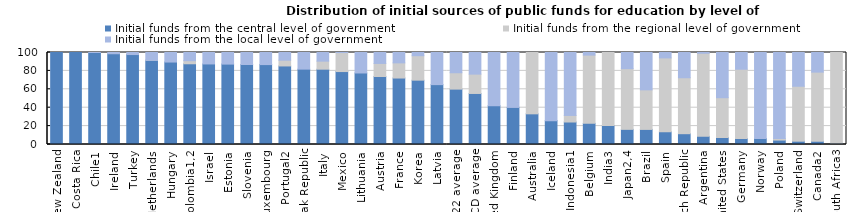
| Category | Initial funds from the central level of government | Initial funds from the regional level of government | Initial funds from the local level of government |
|---|---|---|---|
| New Zealand | 100 | 0 | 0 |
| Costa Rica | 100 | 0 | 0 |
| Chile1 | 99.996 | 0 | 0.004 |
| Ireland | 98.648 | 0 | 1.352 |
| Turkey | 97.771 | 0 | 2.229 |
| Netherlands | 91.533 | 0.035 | 8.432 |
| Hungary | 89.626 | 0 | 10.374 |
| Colombia1,2 | 87.755 | 3.337 | 8.908 |
| Israel | 87.56 | 0 | 12.44 |
| Estonia | 87.383 | 0 | 12.617 |
| Slovenia | 86.948 | 0 | 13.052 |
| Luxembourg | 86.861 | 0 | 13.139 |
| Portugal2 | 85.382 | 6.229 | 8.389 |
| Slovak Republic | 81.916 | 0 | 18.084 |
| Italy | 81.868 | 8.732 | 9.4 |
| Mexico | 79.285 | 20.652 | 0.062 |
| Lithuania | 77.739 | 0 | 22.261 |
| Austria | 73.897 | 14.213 | 11.89 |
| France | 72.253 | 16.474 | 11.274 |
| Korea | 69.94 | 26.56 | 3.5 |
| Latvia | 65.081 | 0 | 34.919 |
| EU22 average | 60.193 | 17.792 | 22.015 |
| OECD average | 55.475 | 21.018 | 23.508 |
| United Kingdom | 42.13 | 0 | 57.87 |
| Finland | 40.304 | 0 | 59.696 |
| Australia | 33.337 | 66.663 | 0 |
| Iceland | 25.945 | 0 | 74.055 |
| Indonesia1 | 24.448 | 7.129 | 68.424 |
| Belgium | 22.999 | 74.182 | 2.819 |
| India3 | 20.553 | 79.447 | 0 |
| Japan2,4 | 16.466 | 65.985 | 17.549 |
| Brazil | 16.405 | 43.002 | 40.593 |
| Spain | 13.747 | 80.38 | 5.874 |
| Czech Republic | 11.749 | 60.808 | 27.442 |
| Argentina | 8.852 | 90.319 | 0.828 |
| United States | 7.61 | 43.261 | 49.129 |
| Germany | 6.542 | 75.304 | 18.154 |
| Norway | 6.52 | 0 | 93.48 |
| Poland | 4.794 | 1.696 | 93.511 |
| Switzerland | 3.596 | 59.728 | 36.675 |
| Canada2 | 3.504 | 75.167 | 21.329 |
| South Africa3 | 1.273 | 98.727 | 0 |